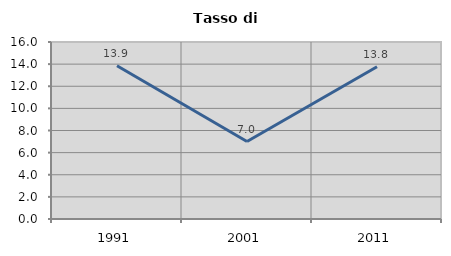
| Category | Tasso di disoccupazione   |
|---|---|
| 1991.0 | 13.855 |
| 2001.0 | 7 |
| 2011.0 | 13.768 |